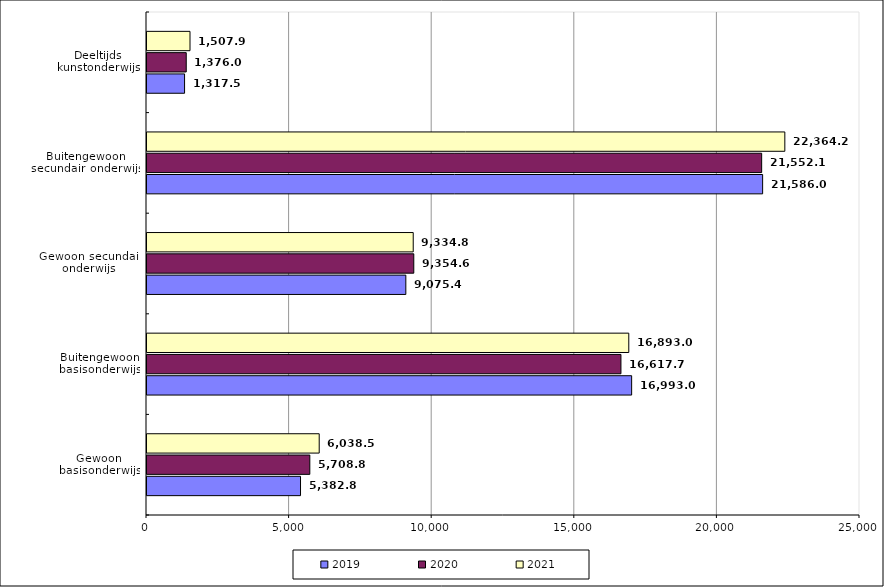
| Category | 2019 | 2020 | 2021 |
|---|---|---|---|
| Gewoon basisonderwijs | 5382.891 | 5708.843 | 6038.504 |
| Buitengewoon basisonderwijs | 16993.033 | 16617.779 | 16893.031 |
| Gewoon secundair onderwijs | 9075.409 | 9354.624 | 9334.816 |
| Buitengewoon secundair onderwijs | 21586.046 | 21552.139 | 22364.284 |
| Deeltijds kunstonderwijs | 1317.499 | 1376.075 | 1507.968 |